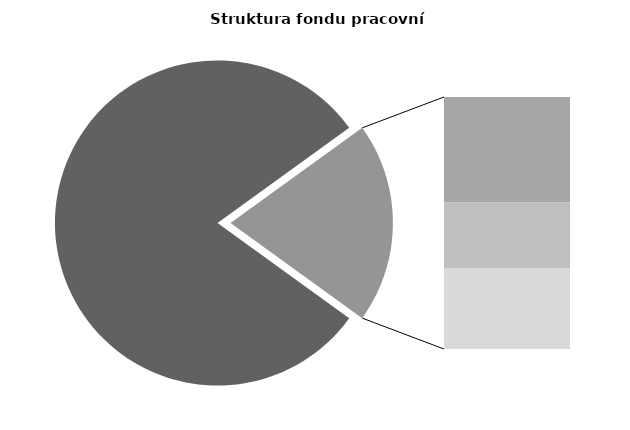
| Category | Series 0 |
|---|---|
| Průměrná měsíční odpracovaná doba bez přesčasu | 136.181 |
| Dovolená | 14.172 |
| Nemoc | 8.806 |
| Jiné | 10.881 |